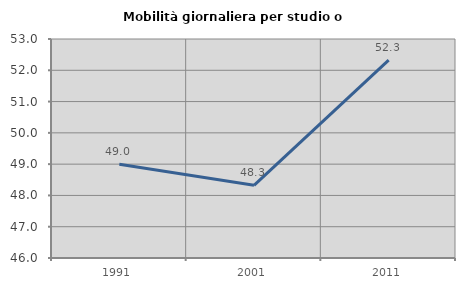
| Category | Mobilità giornaliera per studio o lavoro |
|---|---|
| 1991.0 | 48.999 |
| 2001.0 | 48.324 |
| 2011.0 | 52.326 |